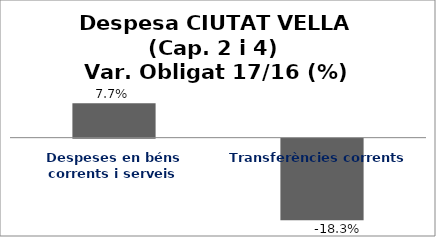
| Category | Series 0 |
|---|---|
| Despeses en béns corrents i serveis | 0.077 |
| Transferències corrents | -0.183 |